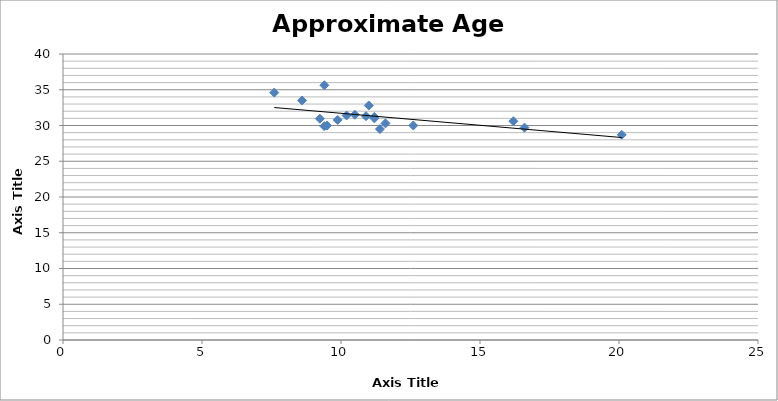
| Category | Approximate Age (years) |
|---|---|
| 12.6 | 30 |
| 11.4 | 29.5 |
| 10.2 | 31.4 |
| 9.5 | 30 |
| 11.2 | 31 |
| 20.1 | 28.7 |
| 8.6 | 33.5 |
| 10.9 | 31.3 |
| 11.6 | 30.3 |
| 11.0 | 32.8 |
| 16.6 | 29.7 |
| 10.5 | 31.5 |
| 11.2 | 31.2 |
| 7.6 | 34.6 |
| 9.24 | 30.95 |
| 9.4 | 29.9 |
| 9.88 | 30.78 |
| 16.2 | 30.6 |
| 9.4 | 35.63 |